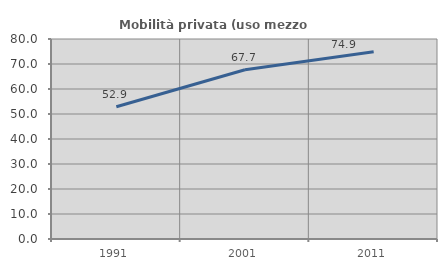
| Category | Mobilità privata (uso mezzo privato) |
|---|---|
| 1991.0 | 52.896 |
| 2001.0 | 67.679 |
| 2011.0 | 74.876 |